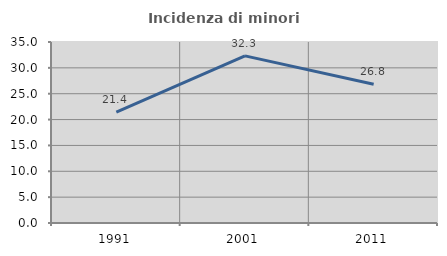
| Category | Incidenza di minori stranieri |
|---|---|
| 1991.0 | 21.429 |
| 2001.0 | 32.323 |
| 2011.0 | 26.834 |